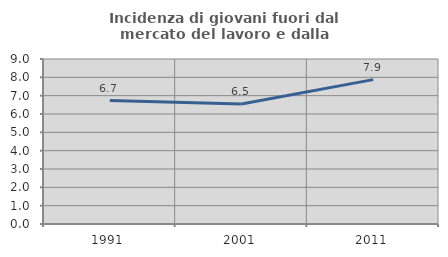
| Category | Incidenza di giovani fuori dal mercato del lavoro e dalla formazione  |
|---|---|
| 1991.0 | 6.731 |
| 2001.0 | 6.548 |
| 2011.0 | 7.874 |